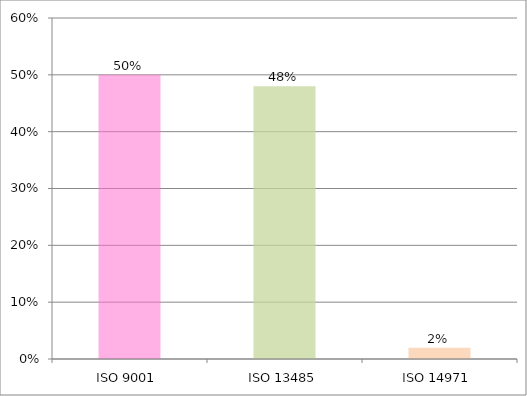
| Category | Series 0 |
|---|---|
| ISO 9001 | 0.5 |
| ISO 13485 | 0.48 |
| ISO 14971 | 0.02 |